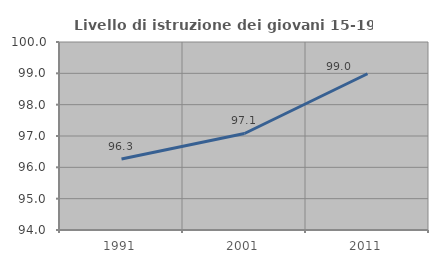
| Category | Livello di istruzione dei giovani 15-19 anni |
|---|---|
| 1991.0 | 96.264 |
| 2001.0 | 97.08 |
| 2011.0 | 98.986 |